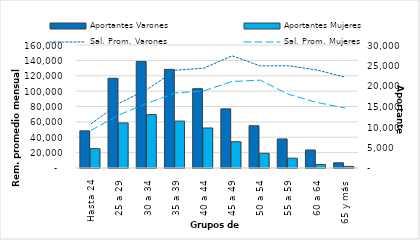
| Category | Aportantes Varones | Aportantes Mujeres |
|---|---|---|
| Hasta 24 | 9059 | 4728 |
| 25 a 29 | 21890 | 10988 |
| 30 a 34 | 25993 | 13024 |
| 35 a 39 | 24061 | 11443 |
| 40 a 44 | 19341 | 9760 |
| 45 a 49 | 14429 | 6407 |
| 50 a 54 | 10309 | 3592 |
| 55 a 59 | 7082 | 2388 |
| 60 a 64 | 4395 | 844 |
| 65 y más | 1272 | 384 |